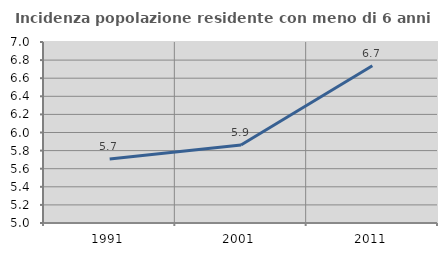
| Category | Incidenza popolazione residente con meno di 6 anni |
|---|---|
| 1991.0 | 5.707 |
| 2001.0 | 5.862 |
| 2011.0 | 6.737 |